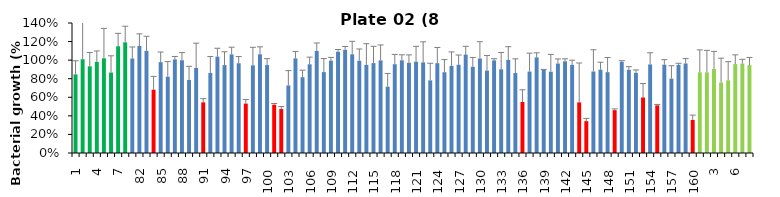
| Category | 8 h % |
|---|---|
| 1.0 | 0.847 |
| 2.0 | 1.01 |
| 3.0 | 0.934 |
| 4.0 | 0.982 |
| 5.0 | 1.02 |
| 6.0 | 0.867 |
| 7.0 | 1.15 |
| 8.0 | 1.192 |
| 81.0 | 1.018 |
| 82.0 | 1.152 |
| 83.0 | 1.1 |
| 84.0 | 0.682 |
| 85.0 | 0.978 |
| 86.0 | 0.821 |
| 87.0 | 1.008 |
| 88.0 | 0.999 |
| 89.0 | 0.787 |
| 90.0 | 0.916 |
| 91.0 | 0.546 |
| 92.0 | 0.862 |
| 93.0 | 1.038 |
| 94.0 | 0.947 |
| 95.0 | 1.062 |
| 96.0 | 0.967 |
| 97.0 | 0.532 |
| 98.0 | 0.944 |
| 99.0 | 1.063 |
| 100.0 | 0.947 |
| 101.0 | 0.52 |
| 102.0 | 0.474 |
| 103.0 | 0.728 |
| 104.0 | 1.019 |
| 105.0 | 0.817 |
| 106.0 | 0.955 |
| 107.0 | 1.099 |
| 108.0 | 0.871 |
| 109.0 | 0.995 |
| 110.0 | 1.09 |
| 111.0 | 1.111 |
| 112.0 | 1.063 |
| 113.0 | 0.994 |
| 114.0 | 0.949 |
| 115.0 | 0.968 |
| 116.0 | 0.998 |
| 117.0 | 0.714 |
| 118.0 | 0.956 |
| 119.0 | 0.998 |
| 120.0 | 0.972 |
| 121.0 | 0.984 |
| 122.0 | 0.976 |
| 123.0 | 0.782 |
| 124.0 | 0.967 |
| 125.0 | 0.87 |
| 126.0 | 0.938 |
| 127.0 | 0.951 |
| 128.0 | 1.061 |
| 129.0 | 0.929 |
| 130.0 | 1.018 |
| 131.0 | 0.888 |
| 132.0 | 0.998 |
| 133.0 | 0.902 |
| 134.0 | 1.001 |
| 135.0 | 0.861 |
| 136.0 | 0.549 |
| 137.0 | 0.877 |
| 138.0 | 1.03 |
| 139.0 | 0.897 |
| 140.0 | 0.875 |
| 141.0 | 0.963 |
| 142.0 | 0.987 |
| 143.0 | 0.949 |
| 144.0 | 0.545 |
| 145.0 | 0.343 |
| 146.0 | 0.878 |
| 147.0 | 0.897 |
| 148.0 | 0.87 |
| 149.0 | 0.461 |
| 150.0 | 0.982 |
| 151.0 | 0.896 |
| 152.0 | 0.863 |
| 153.0 | 0.598 |
| 154.0 | 0.954 |
| 155.0 | 0.513 |
| 156.0 | 0.951 |
| 157.0 | 0.801 |
| 158.0 | 0.949 |
| 159.0 | 0.964 |
| 160.0 | 0.356 |
| 1.0 | 0.869 |
| 2.0 | 0.868 |
| 3.0 | 0.905 |
| 4.0 | 0.759 |
| 5.0 | 0.782 |
| 6.0 | 0.958 |
| 7.0 | 0.963 |
| 8.0 | 0.946 |